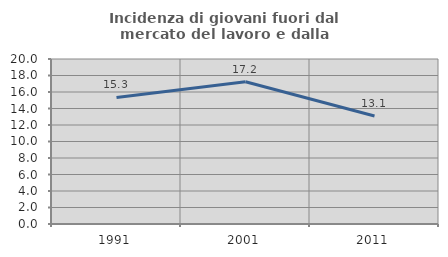
| Category | Incidenza di giovani fuori dal mercato del lavoro e dalla formazione  |
|---|---|
| 1991.0 | 15.342 |
| 2001.0 | 17.241 |
| 2011.0 | 13.095 |